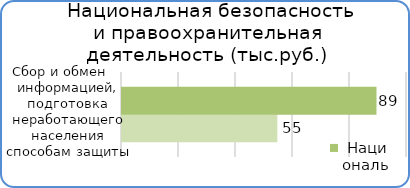
| Category | Факт | План  |
|---|---|---|
| Подготовка населения к действиям при ЧС | 54500 | 89300 |